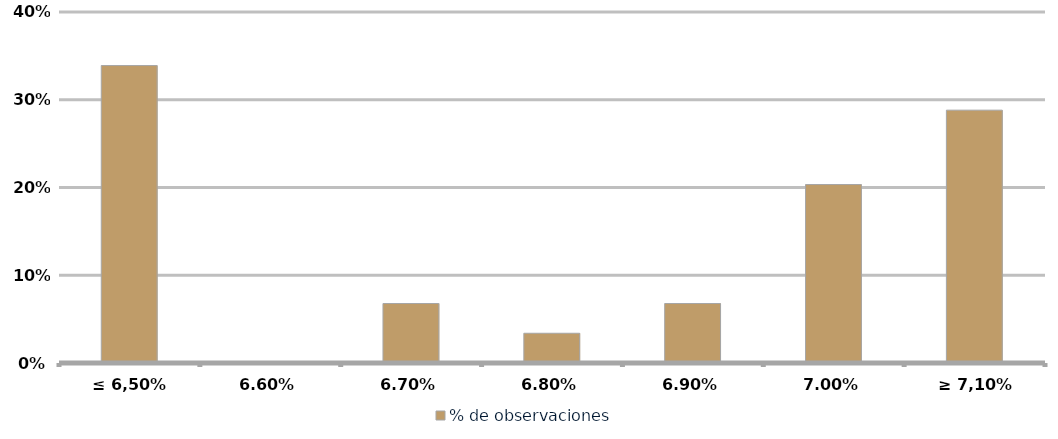
| Category | % de observaciones  |
|---|---|
| ≤ 6,50% | 0.339 |
| 6,60% | 0 |
| 6,70% | 0.068 |
| 6,80% | 0.034 |
| 6,90% | 0.068 |
| 7,00% | 0.203 |
| ≥ 7,10% | 0.288 |